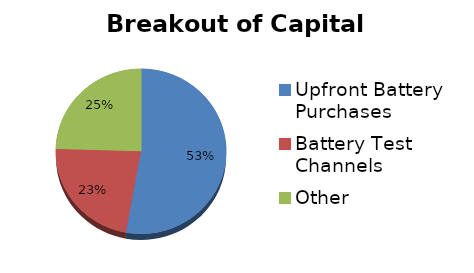
| Category | Series 0 |
|---|---|
| Upfront Battery Purchases | 1634980.44 |
| Battery Test Channels | 700000 |
| Other | 759300 |